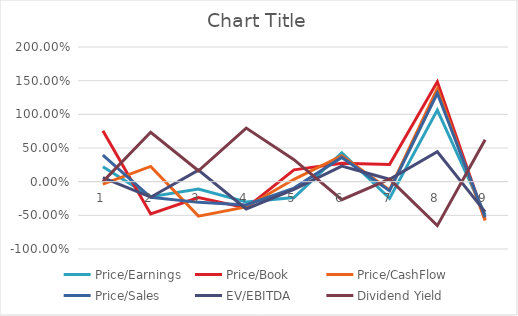
| Category | Price/Earnings | Price/Book | Price/CashFlow | Price/Sales | EV/EBITDA | Dividend Yield |
|---|---|---|---|---|---|---|
| 0 | 0.222 | 0.754 | -0.036 | 0.395 | 0.061 | 0 |
| 1 | -0.222 | -0.478 | 0.226 | -0.232 | -0.231 | 0.734 |
| 2 | -0.108 | -0.236 | -0.512 | -0.307 | 0.171 | 0.162 |
| 3 | -0.302 | -0.39 | -0.375 | -0.346 | -0.406 | 0.796 |
| 4 | -0.235 | 0.176 | 0.035 | -0.095 | -0.115 | 0.327 |
| 5 | 0.43 | 0.275 | 0.387 | 0.36 | 0.232 | -0.268 |
| 6 | -0.249 | 0.254 | -0.122 | -0.135 | 0.035 | 0.039 |
| 7 | 1.064 | 1.484 | 1.382 | 1.312 | 0.445 | -0.653 |
| 8 | -0.492 | -0.565 | -0.578 | -0.526 | -0.448 | 0.624 |